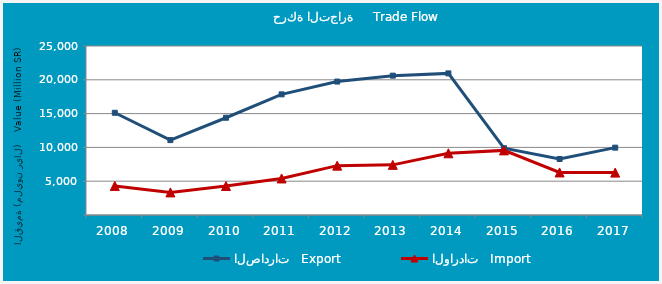
| Category | الصادرات   Export | الواردات   Import |
|---|---|---|
| 2008.0 | 15122203809 | 4300843509 |
| 2009.0 | 11079476058 | 3342012668 |
| 2010.0 | 14388470196 | 4291027767 |
| 2011.0 | 17846864290 | 5407056473 |
| 2012.0 | 19738543102 | 7301227014 |
| 2013.0 | 20614564724 | 7416955679 |
| 2014.0 | 20948701581 | 9126303700 |
| 2015.0 | 9879512691 | 9559237783 |
| 2016.0 | 8285189736 | 6295803665 |
| 2017.0 | 9962955402 | 6272087676 |